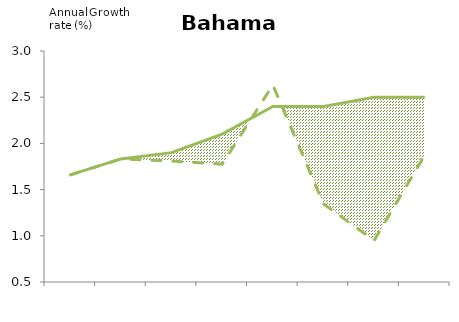
| Category | Series 1 | Series 2 |
|---|---|---|
| 0 | 1.659 | 1.659 |
| 1 | 1.832 | 1.832 |
| 2 | 1.9 | 1.809 |
| 3 | 2.1 | 1.775 |
| 4 | 2.4 | 2.632 |
| 5 | 2.4 | 1.346 |
| 6 | 2.5 | 0.949 |
| 7 | 2.5 | 1.872 |